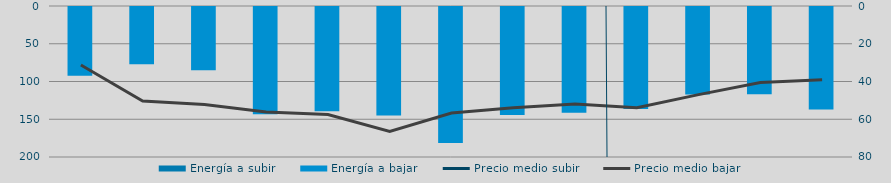
| Category | Energía a subir | Energía a bajar |
|---|---|---|
| D |  | 92.295 |
| E |  | 77.25 |
| F |  | 85.138 |
| M |  | 143.514 |
| A |  | 139.283 |
| M |  | 144.899 |
| J |  | 181.38 |
| J |  | 144.353 |
| A |  | 141.375 |
| S |  | 136.519 |
| O |  | 117.135 |
| N |  | 116.821 |
| D |  | 136.934 |